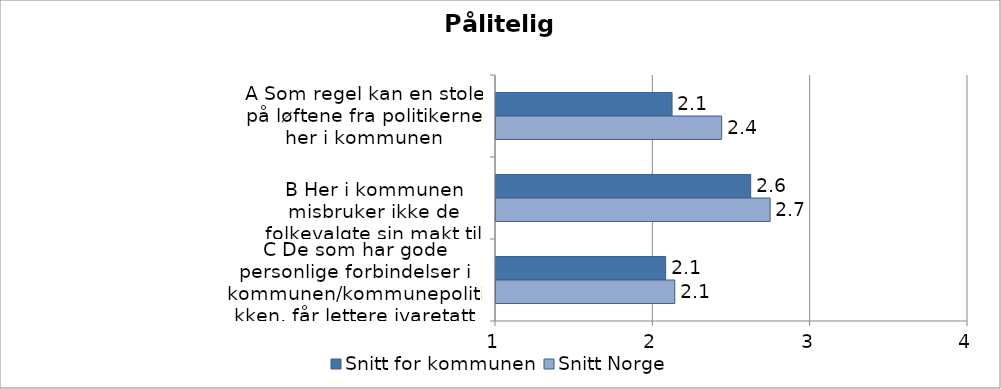
| Category | Snitt for kommunen | Snitt Norge |
|---|---|---|
| A Som regel kan en stole på løftene fra politikerne her i kommunen | 2.119 | 2.434 |
|  
B Her i kommunen misbruker ikke de folkevalgte sin makt til personlig fordel  | 2.619 | 2.742 |
| C De som har gode personlige forbindelser i kommunen/kommunepolitikken, får lettere ivaretatt sine interesser | 2.078 | 2.137 |